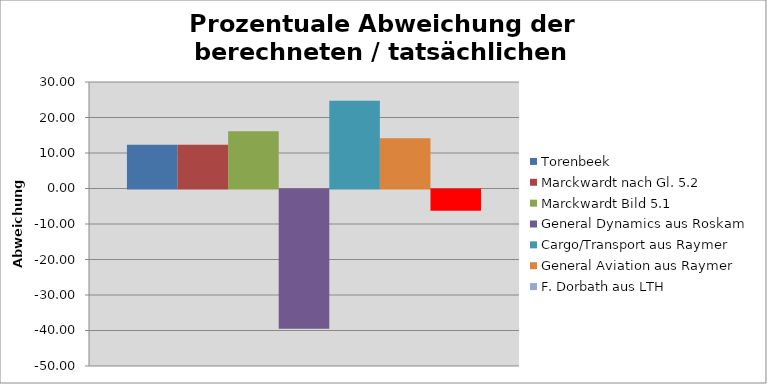
| Category | Torenbeek | Marckwardt nach Gl. 5.2 | Marckwardt Bild 5.1 | General Dynamics aus Roskam | Cargo/Transport aus Raymer | General Aviation aus Raymer | F. Dorbath aus LTH  |
|---|---|---|---|---|---|---|---|
| 0 | 12.317 | 12.357 | 16.124 | -39.203 | 24.753 | 14.15 | -6.013 |